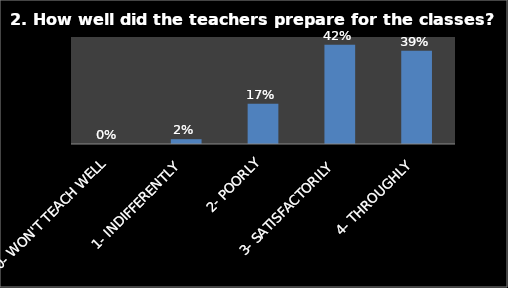
| Category | Series 0 |
|---|---|
| 0- WON'T TEACH WELL | 0 |
| 1- INDIFFERENTLY | 0.02 |
| 2- POORLY | 0.169 |
| 3- SATISFACTORILY | 0.418 |
| 4- THROUGHLY | 0.393 |